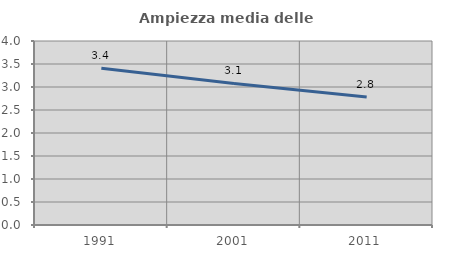
| Category | Ampiezza media delle famiglie |
|---|---|
| 1991.0 | 3.407 |
| 2001.0 | 3.078 |
| 2011.0 | 2.782 |